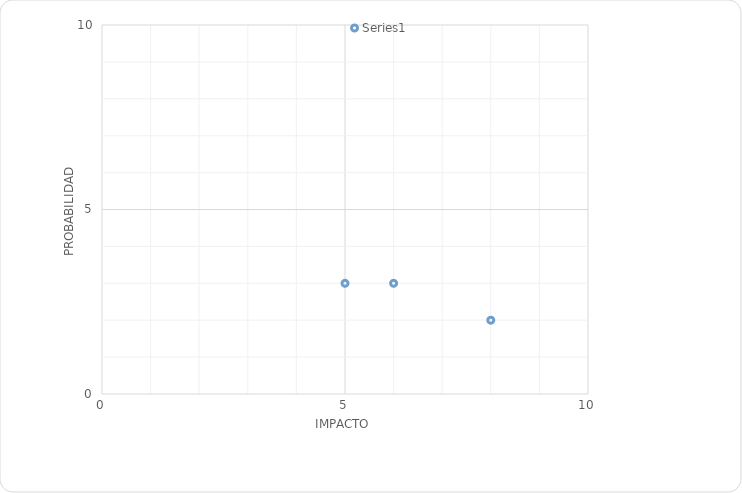
| Category | Series 0 |
|---|---|
| 6.0 | 3 |
| 5.0 | 3 |
| 8.0 | 2 |